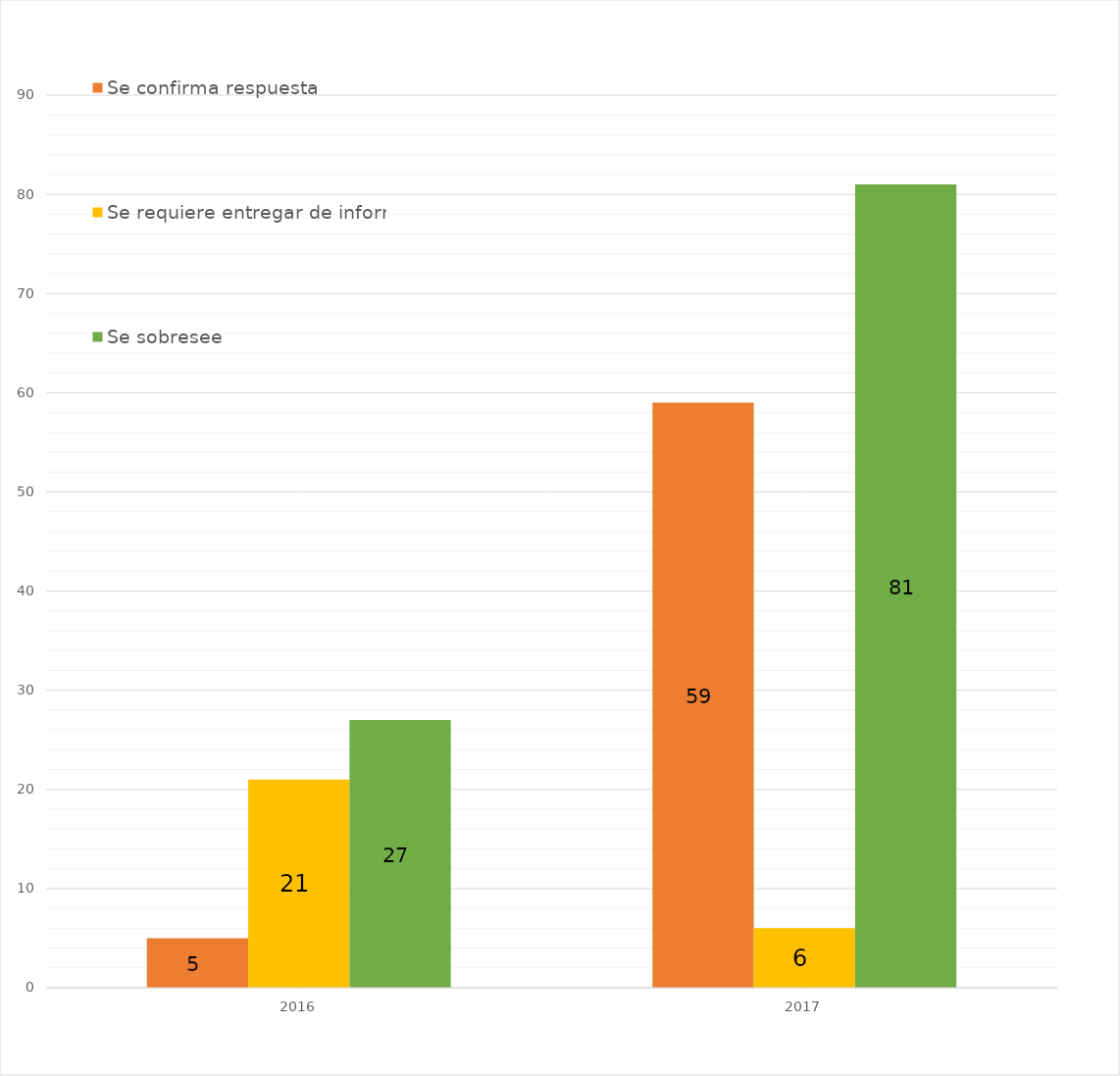
| Category | Se confirma respuesta | Se requiere entregar de información  | Se sobresee  |
|---|---|---|---|
| 2016.0 | 5 | 21 | 27 |
| 2017.0 | 59 | 6 | 81 |